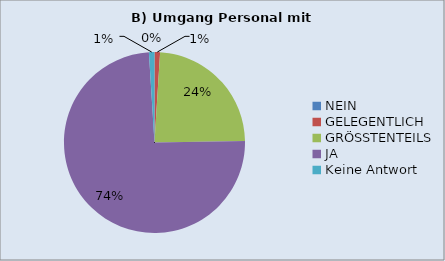
| Category | 7B | 9B | 10B | 11B |
|---|---|---|---|---|
| NEIN | 0 | 0 | 0 | 0 |
| GELEGENTLICH | 1 | 2 | 0 | 3 |
| GRÖSSTENTEILS | 24 | 29 | 14 | 21 |
| JA | 75 | 50 | 83 | 75 |
| Keine Antwort | 1 | 1 | 0 | 2 |